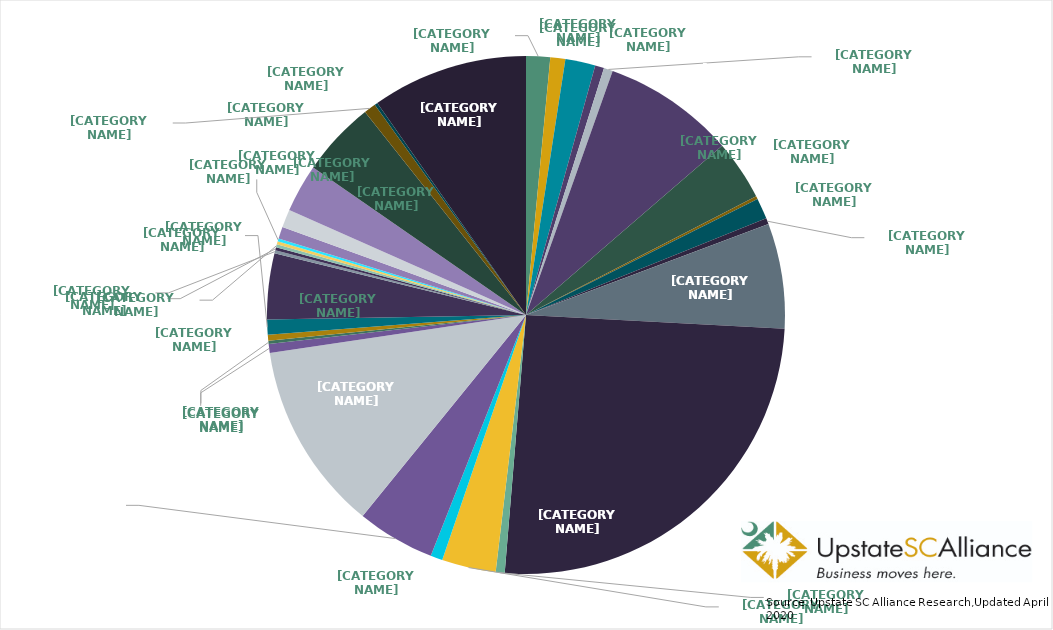
| Category | Percentage |
|---|---|
| Australia | 0.015 |
| Austria | 0.009 |
| Belgium | 0.019 |
| Bermuda | 0.006 |
| Brazil | 0.006 |
| Canada | 0.082 |
| China | 0.037 |
| Czechia | 0.002 |
| Denmark | 0.013 |
| Finland | 0.004 |
| France | 0.066 |
| Germany | 0.255 |
| India | 0.006 |
| Ireland | 0.034 |
| Israel | 0.007 |
| Italy | 0.049 |
| Japan | 0.118 |
| Luxembourg | 0.006 |
| Malaysia | 0.002 |
| Mauritius | 0.004 |
| Mexico | 0.009 |
| Netherlands | 0.041 |
| Philippines | 0.002 |
| Poland | 0.002 |
| Portugal | 0.002 |
| Singapore | 0.002 |
| South Africa | 0.002 |
| South Korea | 0.007 |
| Spain | 0.011 |
| Sweden | 0.03 |
| Switzerland | 0.047 |
| Taiwan | 0.007 |
| United Arab Emirates | 0.002 |
| United Kingdom | 0.097 |